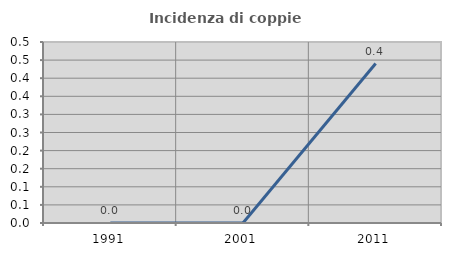
| Category | Incidenza di coppie miste |
|---|---|
| 1991.0 | 0 |
| 2001.0 | 0 |
| 2011.0 | 0.441 |